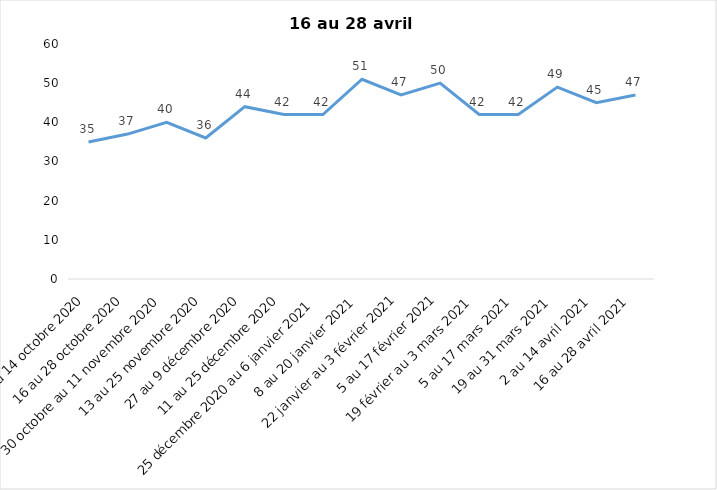
| Category | Toujours aux trois mesures |
|---|---|
| 2 au 14 octobre 2020 | 35 |
| 16 au 28 octobre 2020 | 37 |
| 30 octobre au 11 novembre 2020 | 40 |
| 13 au 25 novembre 2020 | 36 |
| 27 au 9 décembre 2020 | 44 |
| 11 au 25 décembre 2020 | 42 |
| 25 décembre 2020 au 6 janvier 2021 | 42 |
| 8 au 20 janvier 2021 | 51 |
| 22 janvier au 3 février 2021 | 47 |
| 5 au 17 février 2021 | 50 |
| 19 février au 3 mars 2021 | 42 |
| 5 au 17 mars 2021 | 42 |
| 19 au 31 mars 2021 | 49 |
| 2 au 14 avril 2021 | 45 |
| 16 au 28 avril 2021 | 47 |